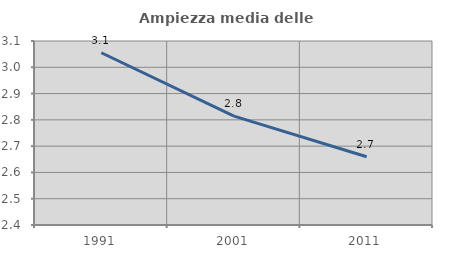
| Category | Ampiezza media delle famiglie |
|---|---|
| 1991.0 | 3.055 |
| 2001.0 | 2.814 |
| 2011.0 | 2.66 |